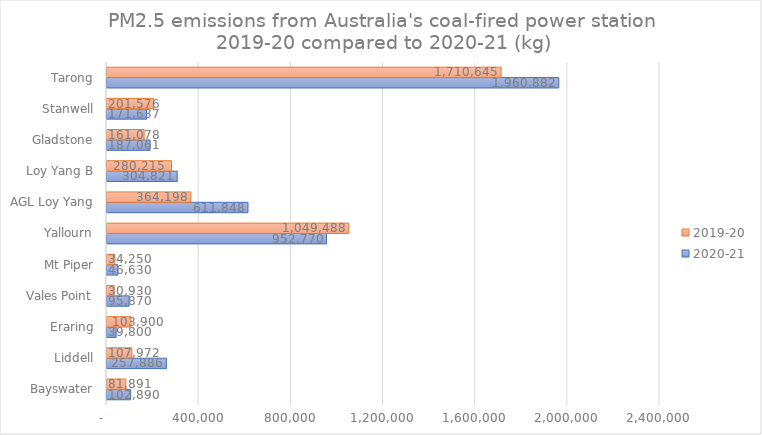
| Category | 2020-21 | 2019-20 |
|---|---|---|
| Bayswater | 102889.543 | 81891.054 |
| Liddell | 257886.112 | 107971.9 |
|  Eraring  | 39800 | 103900 |
| Vales Point | 95870 | 30930 |
| Mt Piper | 46630 | 34250 |
| Yallourn | 952770 | 1049488 |
| AGL Loy Yang | 611847.723 | 364198.225 |
|  Loy Yang B  | 304820.8 | 280215 |
| Gladstone | 187061.3 | 161078 |
| Stanwell | 171637 | 201576 |
| Tarong | 1960882 | 1710645 |